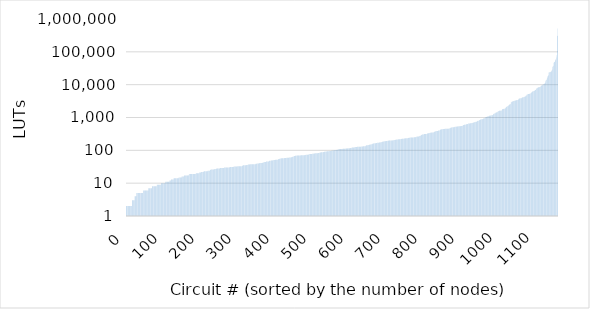
| Category | Series 1 |
|---|---|
| 0.0 | 2 |
| 1.0 | 2 |
| 2.0 | 2 |
| 3.0 | 2 |
| 4.0 | 2 |
| 5.0 | 2 |
| 6.0 | 2 |
| 7.0 | 2 |
| 8.0 | 2 |
| 9.0 | 2 |
| 10.0 | 2 |
| 11.0 | 2 |
| 12.0 | 2 |
| 13.0 | 2 |
| 14.0 | 2 |
| 15.0 | 2 |
| 16.0 | 3 |
| 17.0 | 3 |
| 18.0 | 3 |
| 19.0 | 3 |
| 20.0 | 3 |
| 21.0 | 3 |
| 22.0 | 3 |
| 23.0 | 4 |
| 24.0 | 4 |
| 25.0 | 4 |
| 26.0 | 4 |
| 27.0 | 4 |
| 28.0 | 5 |
| 29.0 | 5 |
| 30.0 | 5 |
| 31.0 | 5 |
| 32.0 | 5 |
| 33.0 | 5 |
| 34.0 | 5 |
| 35.0 | 5 |
| 36.0 | 5 |
| 37.0 | 5 |
| 38.0 | 5 |
| 39.0 | 5 |
| 40.0 | 5 |
| 41.0 | 5 |
| 42.0 | 5 |
| 43.0 | 5 |
| 44.0 | 5 |
| 45.0 | 5 |
| 46.0 | 6 |
| 47.0 | 6 |
| 48.0 | 6 |
| 49.0 | 6 |
| 50.0 | 6 |
| 51.0 | 6 |
| 52.0 | 6 |
| 53.0 | 6 |
| 54.0 | 6 |
| 55.0 | 6 |
| 56.0 | 6 |
| 57.0 | 6 |
| 58.0 | 6 |
| 59.0 | 6 |
| 60.0 | 7 |
| 61.0 | 7 |
| 62.0 | 7 |
| 63.0 | 7 |
| 64.0 | 7 |
| 65.0 | 7 |
| 66.0 | 7 |
| 67.0 | 7 |
| 68.0 | 7 |
| 69.0 | 7 |
| 70.0 | 8 |
| 71.0 | 8 |
| 72.0 | 8 |
| 73.0 | 8 |
| 74.0 | 8 |
| 75.0 | 8 |
| 76.0 | 8 |
| 77.0 | 8 |
| 78.0 | 8 |
| 79.0 | 8 |
| 80.0 | 8 |
| 81.0 | 8 |
| 82.0 | 8 |
| 83.0 | 9 |
| 84.0 | 9 |
| 85.0 | 9 |
| 86.0 | 9 |
| 87.0 | 9 |
| 88.0 | 9 |
| 89.0 | 9 |
| 90.0 | 9 |
| 91.0 | 9 |
| 92.0 | 9 |
| 93.0 | 9 |
| 94.0 | 10 |
| 95.0 | 10 |
| 96.0 | 10 |
| 97.0 | 10 |
| 98.0 | 10 |
| 99.0 | 10 |
| 100.0 | 10 |
| 101.0 | 10 |
| 102.0 | 10 |
| 103.0 | 10 |
| 104.0 | 10 |
| 105.0 | 10 |
| 106.0 | 11 |
| 107.0 | 11 |
| 108.0 | 11 |
| 109.0 | 11 |
| 110.0 | 11 |
| 111.0 | 11 |
| 112.0 | 11 |
| 113.0 | 11 |
| 114.0 | 11 |
| 115.0 | 11 |
| 116.0 | 11 |
| 117.0 | 12 |
| 118.0 | 12 |
| 119.0 | 12 |
| 120.0 | 12 |
| 121.0 | 13 |
| 122.0 | 13 |
| 123.0 | 13 |
| 124.0 | 13 |
| 125.0 | 13 |
| 126.0 | 13 |
| 127.0 | 13 |
| 128.0 | 14 |
| 129.0 | 14 |
| 130.0 | 14 |
| 131.0 | 14 |
| 132.0 | 14 |
| 133.0 | 14 |
| 134.0 | 14 |
| 135.0 | 14 |
| 136.0 | 14 |
| 137.0 | 14 |
| 138.0 | 14 |
| 139.0 | 14 |
| 140.0 | 14 |
| 141.0 | 14 |
| 142.0 | 15 |
| 143.0 | 15 |
| 144.0 | 15 |
| 145.0 | 15 |
| 146.0 | 15 |
| 147.0 | 15 |
| 148.0 | 15 |
| 149.0 | 15 |
| 150.0 | 16 |
| 151.0 | 16 |
| 152.0 | 16 |
| 153.0 | 16 |
| 154.0 | 16 |
| 155.0 | 16 |
| 156.0 | 17 |
| 157.0 | 17 |
| 158.0 | 17 |
| 159.0 | 17 |
| 160.0 | 17 |
| 161.0 | 17 |
| 162.0 | 17 |
| 163.0 | 17 |
| 164.0 | 17 |
| 165.0 | 17 |
| 166.0 | 17 |
| 167.0 | 17 |
| 168.0 | 17 |
| 169.0 | 18 |
| 170.0 | 19 |
| 171.0 | 19 |
| 172.0 | 19 |
| 173.0 | 19 |
| 174.0 | 19 |
| 175.0 | 19 |
| 176.0 | 19 |
| 177.0 | 19 |
| 178.0 | 19 |
| 179.0 | 19 |
| 180.0 | 19 |
| 181.0 | 19 |
| 182.0 | 19 |
| 183.0 | 19 |
| 184.0 | 19 |
| 185.0 | 19 |
| 186.0 | 19 |
| 187.0 | 19 |
| 188.0 | 20 |
| 189.0 | 20 |
| 190.0 | 20 |
| 191.0 | 20 |
| 192.0 | 20 |
| 193.0 | 20 |
| 194.0 | 20 |
| 195.0 | 20 |
| 196.0 | 20 |
| 197.0 | 21 |
| 198.0 | 21 |
| 199.0 | 21 |
| 200.0 | 21 |
| 201.0 | 21 |
| 202.0 | 22 |
| 203.0 | 22 |
| 204.0 | 22 |
| 205.0 | 22 |
| 206.0 | 22 |
| 207.0 | 22 |
| 208.0 | 22 |
| 209.0 | 23 |
| 210.0 | 23 |
| 211.0 | 23 |
| 212.0 | 23 |
| 213.0 | 23 |
| 214.0 | 23 |
| 215.0 | 23 |
| 216.0 | 23 |
| 217.0 | 23 |
| 218.0 | 23 |
| 219.0 | 23 |
| 220.0 | 24 |
| 221.0 | 24 |
| 222.0 | 24 |
| 223.0 | 24 |
| 224.0 | 24 |
| 225.0 | 24 |
| 226.0 | 25 |
| 227.0 | 25 |
| 228.0 | 26 |
| 229.0 | 26 |
| 230.0 | 26 |
| 231.0 | 26 |
| 232.0 | 26 |
| 233.0 | 26 |
| 234.0 | 26 |
| 235.0 | 26 |
| 236.0 | 26 |
| 237.0 | 26 |
| 238.0 | 27 |
| 239.0 | 27 |
| 240.0 | 27 |
| 241.0 | 27 |
| 242.0 | 27 |
| 243.0 | 28 |
| 244.0 | 28 |
| 245.0 | 28 |
| 246.0 | 28 |
| 247.0 | 28 |
| 248.0 | 28 |
| 249.0 | 28 |
| 250.0 | 28 |
| 251.0 | 28 |
| 252.0 | 28 |
| 253.0 | 29 |
| 254.0 | 29 |
| 255.0 | 29 |
| 256.0 | 29 |
| 257.0 | 29 |
| 258.0 | 29 |
| 259.0 | 29 |
| 260.0 | 29 |
| 261.0 | 29 |
| 262.0 | 29 |
| 263.0 | 29 |
| 264.0 | 30 |
| 265.0 | 30 |
| 266.0 | 30 |
| 267.0 | 30 |
| 268.0 | 30 |
| 269.0 | 30 |
| 270.0 | 30 |
| 271.0 | 30 |
| 272.0 | 30 |
| 273.0 | 30 |
| 274.0 | 30 |
| 275.0 | 30 |
| 276.0 | 30 |
| 277.0 | 30 |
| 278.0 | 30 |
| 279.0 | 31 |
| 280.0 | 31 |
| 281.0 | 31 |
| 282.0 | 31 |
| 283.0 | 31 |
| 284.0 | 31 |
| 285.0 | 31 |
| 286.0 | 31 |
| 287.0 | 31 |
| 288.0 | 31 |
| 289.0 | 31 |
| 290.0 | 32 |
| 291.0 | 32 |
| 292.0 | 32 |
| 293.0 | 32 |
| 294.0 | 32 |
| 295.0 | 32 |
| 296.0 | 32 |
| 297.0 | 32 |
| 298.0 | 32 |
| 299.0 | 32 |
| 300.0 | 33 |
| 301.0 | 33 |
| 302.0 | 33 |
| 303.0 | 33 |
| 304.0 | 33 |
| 305.0 | 33 |
| 306.0 | 33 |
| 307.0 | 33 |
| 308.0 | 33 |
| 309.0 | 33 |
| 310.0 | 33 |
| 311.0 | 33 |
| 312.0 | 34 |
| 313.0 | 34 |
| 314.0 | 34 |
| 315.0 | 35 |
| 316.0 | 35 |
| 317.0 | 35 |
| 318.0 | 35 |
| 319.0 | 35 |
| 320.0 | 35 |
| 321.0 | 35 |
| 322.0 | 35 |
| 323.0 | 35 |
| 324.0 | 36 |
| 325.0 | 36 |
| 326.0 | 36 |
| 327.0 | 36 |
| 328.0 | 37 |
| 329.0 | 37 |
| 330.0 | 37 |
| 331.0 | 37 |
| 332.0 | 37 |
| 333.0 | 38 |
| 334.0 | 38 |
| 335.0 | 38 |
| 336.0 | 38 |
| 337.0 | 38 |
| 338.0 | 38 |
| 339.0 | 38 |
| 340.0 | 38 |
| 341.0 | 38 |
| 342.0 | 38 |
| 343.0 | 38 |
| 344.0 | 38 |
| 345.0 | 38 |
| 346.0 | 38 |
| 347.0 | 38 |
| 348.0 | 38 |
| 349.0 | 39 |
| 350.0 | 39 |
| 351.0 | 39 |
| 352.0 | 39 |
| 353.0 | 40 |
| 354.0 | 40 |
| 355.0 | 40 |
| 356.0 | 40 |
| 357.0 | 40 |
| 358.0 | 40 |
| 359.0 | 41 |
| 360.0 | 41 |
| 361.0 | 41 |
| 362.0 | 41 |
| 363.0 | 41 |
| 364.0 | 41 |
| 365.0 | 41 |
| 366.0 | 41 |
| 367.0 | 42 |
| 368.0 | 42 |
| 369.0 | 42 |
| 370.0 | 43 |
| 371.0 | 43 |
| 372.0 | 44 |
| 373.0 | 44 |
| 374.0 | 44 |
| 375.0 | 44 |
| 376.0 | 44 |
| 377.0 | 46 |
| 378.0 | 46 |
| 379.0 | 46 |
| 380.0 | 46 |
| 381.0 | 46 |
| 382.0 | 46 |
| 383.0 | 46 |
| 384.0 | 46 |
| 385.0 | 47 |
| 386.0 | 48 |
| 387.0 | 48 |
| 388.0 | 48 |
| 389.0 | 48 |
| 390.0 | 49 |
| 391.0 | 49 |
| 392.0 | 49 |
| 393.0 | 49 |
| 394.0 | 49 |
| 395.0 | 50 |
| 396.0 | 50 |
| 397.0 | 51 |
| 398.0 | 51 |
| 399.0 | 51 |
| 400.0 | 51 |
| 401.0 | 51 |
| 402.0 | 52 |
| 403.0 | 52 |
| 404.0 | 52 |
| 405.0 | 52 |
| 406.0 | 52 |
| 407.0 | 52 |
| 408.0 | 52 |
| 409.0 | 53 |
| 410.0 | 54 |
| 411.0 | 54 |
| 412.0 | 54 |
| 413.0 | 55 |
| 414.0 | 55 |
| 415.0 | 56 |
| 416.0 | 56 |
| 417.0 | 56 |
| 418.0 | 57 |
| 419.0 | 57 |
| 420.0 | 57 |
| 421.0 | 57 |
| 422.0 | 57 |
| 423.0 | 57 |
| 424.0 | 57 |
| 425.0 | 57 |
| 426.0 | 58 |
| 427.0 | 58 |
| 428.0 | 58 |
| 429.0 | 58 |
| 430.0 | 58 |
| 431.0 | 58 |
| 432.0 | 59 |
| 433.0 | 59 |
| 434.0 | 59 |
| 435.0 | 59 |
| 436.0 | 59 |
| 437.0 | 59 |
| 438.0 | 59 |
| 439.0 | 60 |
| 440.0 | 61 |
| 441.0 | 61 |
| 442.0 | 61 |
| 443.0 | 61 |
| 444.0 | 61 |
| 445.0 | 62 |
| 446.0 | 63 |
| 447.0 | 63 |
| 448.0 | 64 |
| 449.0 | 64 |
| 450.0 | 64 |
| 451.0 | 66 |
| 452.0 | 67 |
| 453.0 | 67 |
| 454.0 | 67 |
| 455.0 | 68 |
| 456.0 | 68 |
| 457.0 | 68 |
| 458.0 | 68 |
| 459.0 | 69 |
| 460.0 | 69 |
| 461.0 | 69 |
| 462.0 | 69 |
| 463.0 | 69 |
| 464.0 | 69 |
| 465.0 | 69 |
| 466.0 | 69 |
| 467.0 | 70 |
| 468.0 | 70 |
| 469.0 | 70 |
| 470.0 | 71 |
| 471.0 | 71 |
| 472.0 | 71 |
| 473.0 | 71 |
| 474.0 | 71 |
| 475.0 | 71 |
| 476.0 | 71 |
| 477.0 | 71 |
| 478.0 | 71 |
| 479.0 | 71 |
| 480.0 | 71 |
| 481.0 | 72 |
| 482.0 | 72 |
| 483.0 | 72 |
| 484.0 | 73 |
| 485.0 | 73 |
| 486.0 | 74 |
| 487.0 | 74 |
| 488.0 | 74 |
| 489.0 | 74 |
| 490.0 | 74 |
| 491.0 | 74 |
| 492.0 | 76 |
| 493.0 | 77 |
| 494.0 | 77 |
| 495.0 | 77 |
| 496.0 | 77 |
| 497.0 | 78 |
| 498.0 | 78 |
| 499.0 | 78 |
| 500.0 | 78 |
| 501.0 | 79 |
| 502.0 | 79 |
| 503.0 | 79 |
| 504.0 | 79 |
| 505.0 | 80 |
| 506.0 | 80 |
| 507.0 | 80 |
| 508.0 | 80 |
| 509.0 | 81 |
| 510.0 | 81 |
| 511.0 | 81 |
| 512.0 | 81 |
| 513.0 | 82 |
| 514.0 | 82 |
| 515.0 | 82 |
| 516.0 | 82 |
| 517.0 | 83 |
| 518.0 | 83 |
| 519.0 | 83 |
| 520.0 | 84 |
| 521.0 | 84 |
| 522.0 | 86 |
| 523.0 | 86 |
| 524.0 | 86 |
| 525.0 | 87 |
| 526.0 | 87 |
| 527.0 | 87 |
| 528.0 | 87 |
| 529.0 | 88 |
| 530.0 | 88 |
| 531.0 | 89 |
| 532.0 | 89 |
| 533.0 | 90 |
| 534.0 | 90 |
| 535.0 | 90 |
| 536.0 | 90 |
| 537.0 | 92 |
| 538.0 | 92 |
| 539.0 | 92 |
| 540.0 | 92 |
| 541.0 | 93 |
| 542.0 | 94 |
| 543.0 | 94 |
| 544.0 | 94 |
| 545.0 | 94 |
| 546.0 | 94 |
| 547.0 | 95 |
| 548.0 | 96 |
| 549.0 | 96 |
| 550.0 | 96 |
| 551.0 | 96 |
| 552.0 | 97 |
| 553.0 | 97 |
| 554.0 | 97 |
| 555.0 | 98 |
| 556.0 | 98 |
| 557.0 | 98 |
| 558.0 | 98 |
| 559.0 | 98 |
| 560.0 | 100 |
| 561.0 | 100 |
| 562.0 | 100 |
| 563.0 | 102 |
| 564.0 | 102 |
| 565.0 | 102 |
| 566.0 | 103 |
| 567.0 | 104 |
| 568.0 | 105 |
| 569.0 | 105 |
| 570.0 | 105 |
| 571.0 | 107 |
| 572.0 | 107 |
| 573.0 | 108 |
| 574.0 | 109 |
| 575.0 | 109 |
| 576.0 | 110 |
| 577.0 | 110 |
| 578.0 | 110 |
| 579.0 | 110 |
| 580.0 | 110 |
| 581.0 | 110 |
| 582.0 | 110 |
| 583.0 | 111 |
| 584.0 | 111 |
| 585.0 | 111 |
| 586.0 | 111 |
| 587.0 | 111 |
| 588.0 | 111 |
| 589.0 | 112 |
| 590.0 | 112 |
| 591.0 | 113 |
| 592.0 | 113 |
| 593.0 | 113 |
| 594.0 | 114 |
| 595.0 | 114 |
| 596.0 | 114 |
| 597.0 | 115 |
| 598.0 | 115 |
| 599.0 | 115 |
| 600.0 | 115 |
| 601.0 | 115 |
| 602.0 | 115 |
| 603.0 | 118 |
| 604.0 | 118 |
| 605.0 | 118 |
| 606.0 | 118 |
| 607.0 | 120 |
| 608.0 | 121 |
| 609.0 | 122 |
| 610.0 | 122 |
| 611.0 | 122 |
| 612.0 | 122 |
| 613.0 | 123 |
| 614.0 | 123 |
| 615.0 | 125 |
| 616.0 | 126 |
| 617.0 | 126 |
| 618.0 | 127 |
| 619.0 | 127 |
| 620.0 | 127 |
| 621.0 | 127 |
| 622.0 | 128 |
| 623.0 | 128 |
| 624.0 | 128 |
| 625.0 | 128 |
| 626.0 | 128 |
| 627.0 | 129 |
| 628.0 | 129 |
| 629.0 | 129 |
| 630.0 | 129 |
| 631.0 | 129 |
| 632.0 | 129 |
| 633.0 | 130 |
| 634.0 | 130 |
| 635.0 | 130 |
| 636.0 | 131 |
| 637.0 | 131 |
| 638.0 | 132 |
| 639.0 | 132 |
| 640.0 | 132 |
| 641.0 | 132 |
| 642.0 | 134 |
| 643.0 | 134 |
| 644.0 | 134 |
| 645.0 | 139 |
| 646.0 | 140 |
| 647.0 | 142 |
| 648.0 | 142 |
| 649.0 | 144 |
| 650.0 | 144 |
| 651.0 | 144 |
| 652.0 | 145 |
| 653.0 | 146 |
| 654.0 | 147 |
| 655.0 | 148 |
| 656.0 | 148 |
| 657.0 | 149 |
| 658.0 | 150 |
| 659.0 | 152 |
| 660.0 | 152 |
| 661.0 | 152 |
| 662.0 | 153 |
| 663.0 | 158 |
| 664.0 | 158 |
| 665.0 | 161 |
| 666.0 | 162 |
| 667.0 | 162 |
| 668.0 | 163 |
| 669.0 | 163 |
| 670.0 | 163 |
| 671.0 | 163 |
| 672.0 | 164 |
| 673.0 | 166 |
| 674.0 | 167 |
| 675.0 | 167 |
| 676.0 | 171 |
| 677.0 | 171 |
| 678.0 | 171 |
| 679.0 | 171 |
| 680.0 | 171 |
| 681.0 | 172 |
| 682.0 | 172 |
| 683.0 | 174 |
| 684.0 | 174 |
| 685.0 | 175 |
| 686.0 | 175 |
| 687.0 | 177 |
| 688.0 | 178 |
| 689.0 | 181 |
| 690.0 | 182 |
| 691.0 | 183 |
| 692.0 | 184 |
| 693.0 | 185 |
| 694.0 | 188 |
| 695.0 | 189 |
| 696.0 | 190 |
| 697.0 | 190 |
| 698.0 | 190 |
| 699.0 | 192 |
| 700.0 | 192 |
| 701.0 | 193 |
| 702.0 | 194 |
| 703.0 | 194 |
| 704.0 | 196 |
| 705.0 | 196 |
| 706.0 | 196 |
| 707.0 | 198 |
| 708.0 | 198 |
| 709.0 | 198 |
| 710.0 | 199 |
| 711.0 | 199 |
| 712.0 | 199 |
| 713.0 | 200 |
| 714.0 | 200 |
| 715.0 | 201 |
| 716.0 | 201 |
| 717.0 | 201 |
| 718.0 | 202 |
| 719.0 | 202 |
| 720.0 | 202 |
| 721.0 | 205 |
| 722.0 | 205 |
| 723.0 | 206 |
| 724.0 | 207 |
| 725.0 | 210 |
| 726.0 | 211 |
| 727.0 | 211 |
| 728.0 | 212 |
| 729.0 | 212 |
| 730.0 | 213 |
| 731.0 | 214 |
| 732.0 | 215 |
| 733.0 | 216 |
| 734.0 | 216 |
| 735.0 | 216 |
| 736.0 | 216 |
| 737.0 | 217 |
| 738.0 | 218 |
| 739.0 | 220 |
| 740.0 | 222 |
| 741.0 | 222 |
| 742.0 | 224 |
| 743.0 | 225 |
| 744.0 | 226 |
| 745.0 | 226 |
| 746.0 | 226 |
| 747.0 | 227 |
| 748.0 | 228 |
| 749.0 | 231 |
| 750.0 | 231 |
| 751.0 | 231 |
| 752.0 | 232 |
| 753.0 | 232 |
| 754.0 | 233 |
| 755.0 | 234 |
| 756.0 | 234 |
| 757.0 | 234 |
| 758.0 | 234 |
| 759.0 | 239 |
| 760.0 | 239 |
| 761.0 | 240 |
| 762.0 | 241 |
| 763.0 | 242 |
| 764.0 | 242 |
| 765.0 | 244 |
| 766.0 | 245 |
| 767.0 | 247 |
| 768.0 | 247 |
| 769.0 | 247 |
| 770.0 | 247 |
| 771.0 | 248 |
| 772.0 | 248 |
| 773.0 | 248 |
| 774.0 | 249 |
| 775.0 | 251 |
| 776.0 | 251 |
| 777.0 | 251 |
| 778.0 | 251 |
| 779.0 | 252 |
| 780.0 | 256 |
| 781.0 | 257 |
| 782.0 | 257 |
| 783.0 | 259 |
| 784.0 | 262 |
| 785.0 | 263 |
| 786.0 | 263 |
| 787.0 | 265 |
| 788.0 | 266 |
| 789.0 | 270 |
| 790.0 | 272 |
| 791.0 | 276 |
| 792.0 | 277 |
| 793.0 | 278 |
| 794.0 | 288 |
| 795.0 | 295 |
| 796.0 | 296 |
| 797.0 | 305 |
| 798.0 | 305 |
| 799.0 | 306 |
| 800.0 | 306 |
| 801.0 | 308 |
| 802.0 | 312 |
| 803.0 | 314 |
| 804.0 | 314 |
| 805.0 | 315 |
| 806.0 | 315 |
| 807.0 | 315 |
| 808.0 | 316 |
| 809.0 | 317 |
| 810.0 | 319 |
| 811.0 | 324 |
| 812.0 | 329 |
| 813.0 | 331 |
| 814.0 | 332 |
| 815.0 | 332 |
| 816.0 | 337 |
| 817.0 | 337 |
| 818.0 | 341 |
| 819.0 | 342 |
| 820.0 | 342 |
| 821.0 | 346 |
| 822.0 | 348 |
| 823.0 | 348 |
| 824.0 | 349 |
| 825.0 | 349 |
| 826.0 | 350 |
| 827.0 | 351 |
| 828.0 | 356 |
| 829.0 | 362 |
| 830.0 | 365 |
| 831.0 | 372 |
| 832.0 | 376 |
| 833.0 | 382 |
| 834.0 | 384 |
| 835.0 | 391 |
| 836.0 | 391 |
| 837.0 | 391 |
| 838.0 | 391 |
| 839.0 | 391 |
| 840.0 | 394 |
| 841.0 | 400 |
| 842.0 | 400 |
| 843.0 | 400 |
| 844.0 | 407 |
| 845.0 | 421 |
| 846.0 | 424 |
| 847.0 | 428 |
| 848.0 | 430 |
| 849.0 | 435 |
| 850.0 | 438 |
| 851.0 | 440 |
| 852.0 | 443 |
| 853.0 | 445 |
| 854.0 | 448 |
| 855.0 | 448 |
| 856.0 | 448 |
| 857.0 | 450 |
| 858.0 | 451 |
| 859.0 | 451 |
| 860.0 | 452 |
| 861.0 | 452 |
| 862.0 | 454 |
| 863.0 | 454 |
| 864.0 | 455 |
| 865.0 | 455 |
| 866.0 | 457 |
| 867.0 | 457 |
| 868.0 | 458 |
| 869.0 | 463 |
| 870.0 | 463 |
| 871.0 | 470 |
| 872.0 | 472 |
| 873.0 | 477 |
| 874.0 | 495 |
| 875.0 | 498 |
| 876.0 | 499 |
| 877.0 | 499 |
| 878.0 | 501 |
| 879.0 | 502 |
| 880.0 | 507 |
| 881.0 | 507 |
| 882.0 | 508 |
| 883.0 | 509 |
| 884.0 | 510 |
| 885.0 | 523 |
| 886.0 | 523 |
| 887.0 | 523 |
| 888.0 | 523 |
| 889.0 | 527 |
| 890.0 | 528 |
| 891.0 | 532 |
| 892.0 | 534 |
| 893.0 | 535 |
| 894.0 | 535 |
| 895.0 | 538 |
| 896.0 | 539 |
| 897.0 | 539 |
| 898.0 | 542 |
| 899.0 | 543 |
| 900.0 | 544 |
| 901.0 | 548 |
| 902.0 | 549 |
| 903.0 | 550 |
| 904.0 | 554 |
| 905.0 | 556 |
| 906.0 | 564 |
| 907.0 | 584 |
| 908.0 | 586 |
| 909.0 | 587 |
| 910.0 | 602 |
| 911.0 | 604 |
| 912.0 | 605 |
| 913.0 | 605 |
| 914.0 | 611 |
| 915.0 | 619 |
| 916.0 | 620 |
| 917.0 | 625 |
| 918.0 | 625 |
| 919.0 | 637 |
| 920.0 | 637 |
| 921.0 | 651 |
| 922.0 | 653 |
| 923.0 | 655 |
| 924.0 | 656 |
| 925.0 | 660 |
| 926.0 | 667 |
| 927.0 | 667 |
| 928.0 | 667 |
| 929.0 | 668 |
| 930.0 | 676 |
| 931.0 | 680 |
| 932.0 | 684 |
| 933.0 | 688 |
| 934.0 | 692 |
| 935.0 | 702 |
| 936.0 | 705 |
| 937.0 | 711 |
| 938.0 | 719 |
| 939.0 | 723 |
| 940.0 | 723 |
| 941.0 | 737 |
| 942.0 | 737 |
| 943.0 | 745 |
| 944.0 | 747 |
| 945.0 | 763 |
| 946.0 | 780 |
| 947.0 | 793 |
| 948.0 | 797 |
| 949.0 | 797 |
| 950.0 | 827 |
| 951.0 | 830 |
| 952.0 | 837 |
| 953.0 | 854 |
| 954.0 | 865 |
| 955.0 | 875 |
| 956.0 | 886 |
| 957.0 | 888 |
| 958.0 | 888 |
| 959.0 | 892 |
| 960.0 | 904 |
| 961.0 | 921 |
| 962.0 | 930 |
| 963.0 | 948 |
| 964.0 | 954 |
| 965.0 | 954 |
| 966.0 | 995 |
| 967.0 | 1026 |
| 968.0 | 1026 |
| 969.0 | 1040 |
| 970.0 | 1040 |
| 971.0 | 1051 |
| 972.0 | 1075 |
| 973.0 | 1078 |
| 974.0 | 1078 |
| 975.0 | 1093 |
| 976.0 | 1114 |
| 977.0 | 1121 |
| 978.0 | 1123 |
| 979.0 | 1130 |
| 980.0 | 1130 |
| 981.0 | 1145 |
| 982.0 | 1159 |
| 983.0 | 1171 |
| 984.0 | 1171 |
| 985.0 | 1181 |
| 986.0 | 1181 |
| 987.0 | 1200 |
| 988.0 | 1240 |
| 989.0 | 1275 |
| 990.0 | 1307 |
| 991.0 | 1323 |
| 992.0 | 1327 |
| 993.0 | 1327 |
| 994.0 | 1396 |
| 995.0 | 1404 |
| 996.0 | 1416 |
| 997.0 | 1429 |
| 998.0 | 1435 |
| 999.0 | 1453 |
| 1000.0 | 1509 |
| 1001.0 | 1516 |
| 1002.0 | 1540 |
| 1003.0 | 1588 |
| 1004.0 | 1593 |
| 1005.0 | 1597 |
| 1006.0 | 1607 |
| 1007.0 | 1612 |
| 1008.0 | 1614 |
| 1009.0 | 1621 |
| 1010.0 | 1622 |
| 1011.0 | 1636 |
| 1012.0 | 1768 |
| 1013.0 | 1798 |
| 1014.0 | 1800 |
| 1015.0 | 1803 |
| 1016.0 | 1827 |
| 1017.0 | 1838 |
| 1018.0 | 1839 |
| 1019.0 | 1856 |
| 1020.0 | 1856 |
| 1021.0 | 1933 |
| 1022.0 | 2034 |
| 1023.0 | 2039 |
| 1024.0 | 2081 |
| 1025.0 | 2164 |
| 1026.0 | 2191 |
| 1027.0 | 2191 |
| 1028.0 | 2203 |
| 1029.0 | 2271 |
| 1030.0 | 2394 |
| 1031.0 | 2432 |
| 1032.0 | 2481 |
| 1033.0 | 2489 |
| 1034.0 | 2550 |
| 1035.0 | 2594 |
| 1036.0 | 2856 |
| 1037.0 | 2987 |
| 1038.0 | 2998 |
| 1039.0 | 3045 |
| 1040.0 | 3050 |
| 1041.0 | 3076 |
| 1042.0 | 3105 |
| 1043.0 | 3202 |
| 1044.0 | 3202 |
| 1045.0 | 3219 |
| 1046.0 | 3221 |
| 1047.0 | 3306 |
| 1048.0 | 3307 |
| 1049.0 | 3318 |
| 1050.0 | 3339 |
| 1051.0 | 3379 |
| 1052.0 | 3385 |
| 1053.0 | 3396 |
| 1054.0 | 3403 |
| 1055.0 | 3471 |
| 1056.0 | 3518 |
| 1057.0 | 3703 |
| 1058.0 | 3778 |
| 1059.0 | 3793 |
| 1060.0 | 3810 |
| 1061.0 | 3844 |
| 1062.0 | 3847 |
| 1063.0 | 3862 |
| 1064.0 | 3871 |
| 1065.0 | 3970 |
| 1066.0 | 3972 |
| 1067.0 | 4130 |
| 1068.0 | 4138 |
| 1069.0 | 4139 |
| 1070.0 | 4154 |
| 1071.0 | 4203 |
| 1072.0 | 4244 |
| 1073.0 | 4330 |
| 1074.0 | 4350 |
| 1075.0 | 4351 |
| 1076.0 | 4633 |
| 1077.0 | 4637 |
| 1078.0 | 4784 |
| 1079.0 | 4978 |
| 1080.0 | 5018 |
| 1081.0 | 5066 |
| 1082.0 | 5176 |
| 1083.0 | 5208 |
| 1084.0 | 5216 |
| 1085.0 | 5217 |
| 1086.0 | 5278 |
| 1087.0 | 5322 |
| 1088.0 | 5368 |
| 1089.0 | 5490 |
| 1090.0 | 5654 |
| 1091.0 | 5786 |
| 1092.0 | 5856 |
| 1093.0 | 6077 |
| 1094.0 | 6200 |
| 1095.0 | 6205 |
| 1096.0 | 6283 |
| 1097.0 | 6422 |
| 1098.0 | 6440 |
| 1099.0 | 6533 |
| 1100.0 | 6655 |
| 1101.0 | 6825 |
| 1102.0 | 6881 |
| 1103.0 | 6949 |
| 1104.0 | 7508 |
| 1105.0 | 7622 |
| 1106.0 | 7813 |
| 1107.0 | 8034 |
| 1108.0 | 8036 |
| 1109.0 | 8131 |
| 1110.0 | 8288 |
| 1111.0 | 8322 |
| 1112.0 | 8323 |
| 1113.0 | 8464 |
| 1114.0 | 8531 |
| 1115.0 | 8741 |
| 1116.0 | 8831 |
| 1117.0 | 9209 |
| 1118.0 | 9408 |
| 1119.0 | 9457 |
| 1120.0 | 9598 |
| 1121.0 | 9615 |
| 1122.0 | 10186 |
| 1123.0 | 10320 |
| 1124.0 | 10353 |
| 1125.0 | 10447 |
| 1126.0 | 10820 |
| 1127.0 | 10912 |
| 1128.0 | 11304 |
| 1129.0 | 12407 |
| 1130.0 | 13429 |
| 1131.0 | 13777 |
| 1132.0 | 14485 |
| 1133.0 | 15821 |
| 1134.0 | 16906 |
| 1135.0 | 18277 |
| 1136.0 | 18384 |
| 1137.0 | 19867 |
| 1138.0 | 23621 |
| 1139.0 | 23779 |
| 1140.0 | 23867 |
| 1141.0 | 23995 |
| 1142.0 | 24137 |
| 1143.0 | 24607 |
| 1144.0 | 24752 |
| 1145.0 | 26455 |
| 1146.0 | 26868 |
| 1147.0 | 28839 |
| 1148.0 | 34409 |
| 1149.0 | 36466 |
| 1150.0 | 37391 |
| 1151.0 | 46534 |
| 1152.0 | 48205 |
| 1153.0 | 48988 |
| 1154.0 | 50174 |
| 1155.0 | 55251 |
| 1156.0 | 55251 |
| 1157.0 | 60603 |
| 1158.0 | 66681 |
| 1159.0 | 78112 |
| 1160.0 | 304878 |
| 1161.0 | 307143 |
| 1162.0 | 514641 |